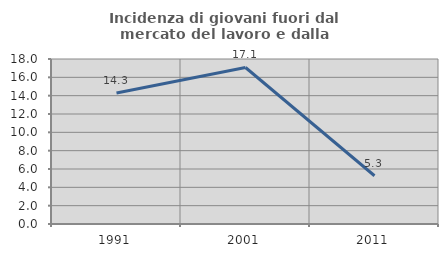
| Category | Incidenza di giovani fuori dal mercato del lavoro e dalla formazione  |
|---|---|
| 1991.0 | 14.286 |
| 2001.0 | 17.073 |
| 2011.0 | 5.263 |